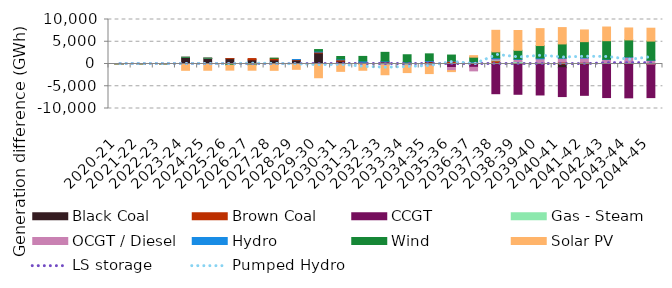
| Category | Black Coal | Brown Coal | CCGT | Gas - Steam | OCGT / Diesel | Hydro | Wind | Solar PV |
|---|---|---|---|---|---|---|---|---|
| 2020-21 | -0.009 | -0.001 | 0.003 | -0.001 | 0.004 | 0.005 | -0.001 | 0.003 |
| 2021-22 | -0.008 | -0.001 | 0.003 | 0.001 | 0.003 | 0 | -0.001 | 0.004 |
| 2022-23 | -0.03 | 0.004 | 0.007 | 0 | 0.004 | -0.001 | -0.012 | 0.004 |
| 2023-24 | 1470.395 | 13.051 | 10.528 | 0.285 | 3.438 | -26.139 | 15.642 | -1393.64 |
| 2024-25 | 1264.93 | 13.531 | 11.535 | 5.692 | 1.972 | -48.928 | 13.296 | -1358.554 |
| 2025-26 | 1192.239 | 7.292 | -13.475 | -5.939 | -7.873 | -19.44 | -229.337 | -1102.597 |
| 2026-27 | 939.192 | 284.089 | -21.603 | -31.026 | -27.335 | -70.471 | -75.709 | -1170.954 |
| 2027-28 | 924.563 | 347.568 | -16.245 | -25.82 | -15.457 | -62.606 | 31.999 | -1305.794 |
| 2028-29 | 874.635 | 114.804 | -7.294 | -25.053 | -14.479 | 10.549 | -28.63 | -1124.074 |
| 2029-30 | 2467.206 | 214.791 | -41.966 | -22.084 | -28.169 | 204.155 | 362.991 | -2997.361 |
| 2030-31 | 630.718 | 311.834 | -54.308 | -89.165 | -54.767 | 163.62 | 580.731 | -1455.457 |
| 2031-32 | 249.069 | 130.759 | -45.826 | -20.179 | -20.67 | 297.507 | 1027.542 | -1322.474 |
| 2032-33 | -39.687 | 414.104 | 94.528 | -142.042 | -118.643 | 164.973 | 1945.12 | -2111.541 |
| 2033-34 | -31.756 | 222.4 | -107.727 | -135.038 | -101.307 | 205.742 | 1650.293 | -1553.003 |
| 2034-35 | 396.213 | 193.258 | -193.151 | -122.746 | -141.795 | 202.739 | 1490.464 | -1695.628 |
| 2035-36 | 76.636 | 575.954 | -788.496 | -0.018 | -691.695 | 72.975 | 1286.482 | -231.608 |
| 2036-37 | -189.782 | 341.105 | -553.665 | 24.418 | -801.28 | 117.107 | 1050.557 | 343.817 |
| 2037-38 | 41.45 | 686.357 | -6675.277 | 150.751 | 288.818 | 226.861 | 1330.206 | 4848.712 |
| 2038-39 | -34.322 | 205.615 | -6768.926 | 333.045 | 467.636 | 144.952 | 1926.843 | 4454.149 |
| 2039-40 | 83.56 | 225.981 | -6960.321 | 0 | 849.552 | 204.088 | 2781.845 | 3805.154 |
| 2040-41 | -841.514 | 440.95 | -6477.628 | 0 | 852.314 | 92.101 | 3124.037 | 3673.958 |
| 2041-42 | -224.099 | 394.624 | -6816.545 | 0 | 942.608 | 129.815 | 3553.224 | 2631.781 |
| 2042-43 | -22.945 | 115.351 | -7518.833 | 0 | 887.142 | 79.861 | 4155.222 | 3074.869 |
| 2043-44 | -127.315 | 262.928 | -7476.897 | 0 | 1274.542 | 72.93 | 3805.809 | 2680.923 |
| 2044-45 | -133.242 | -39.462 | -7379.573 | 0 | 825.495 | 41.726 | 4281.558 | 2894.322 |